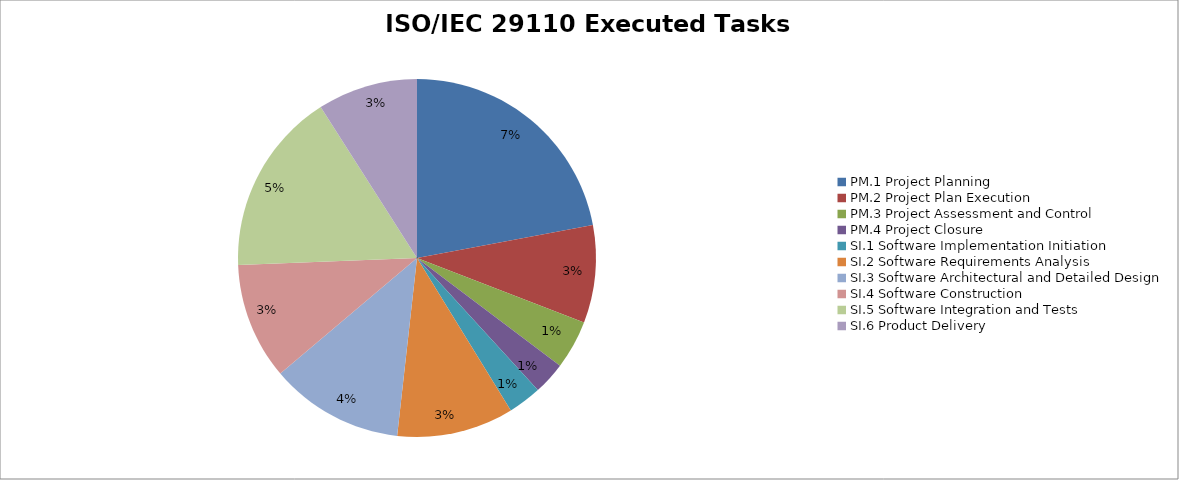
| Category | % Point of the 67 tasks |
|---|---|
| PM.1 Project Planning | 0.073 |
| PM.2 Project Plan Execution | 0.029 |
| PM.3 Project Assessment and Control | 0.015 |
| PM.4 Project Closure | 0.01 |
| SI.1 Software Implementation Initiation | 0.01 |
| SI.2 Software Requirements Analysis | 0.035 |
| SI.3 Software Architectural and Detailed Design | 0.04 |
| SI.4 Software Construction | 0.035 |
| SI.5 Software Integration and Tests | 0.055 |
| SI.6 Product Delivery | 0.03 |